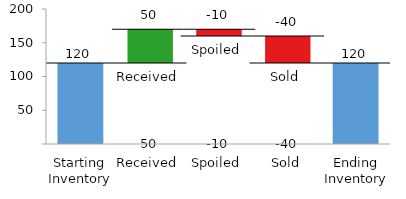
| Category | Ends |
|---|---|
| Starting Inventory | 120 |
| Received | 0 |
| Spoiled | 0 |
| Sold | 0 |
| Ending Inventory | 120 |